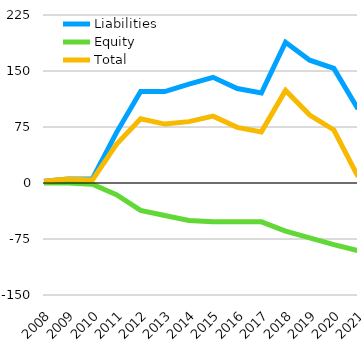
| Category | Liabilities  | Equity  | Total  |
|---|---|---|---|
| 2008 | 2.5 | 0 | 2.5 |
| 2009 | 5.5 | 0 | 5.5 |
| 2010 | 5.5 | -1.6 | 3.9 |
| 2011 | 67.5 | -15.6 | 51.9 |
| 2012 | 122.5 | -36.6 | 85.9 |
| 2013 | 122.5 | -43.6 | 78.9 |
| 2014 | 132.5 | -50.3 | 82.2 |
| 2015 | 141.5 | -52 | 89.5 |
| 2016 | 126.5 | -52 | 74.5 |
| 2017 | 120.5 | -52 | 68.5 |
| 2018 | 188.5 | -64.5 | 124 |
| 2019 | 164.5 | -73.5 | 91 |
| 2020 | 153.5 | -82.5 | 71 |
| 2021 | 99.141 | -90.6 | 8.541 |